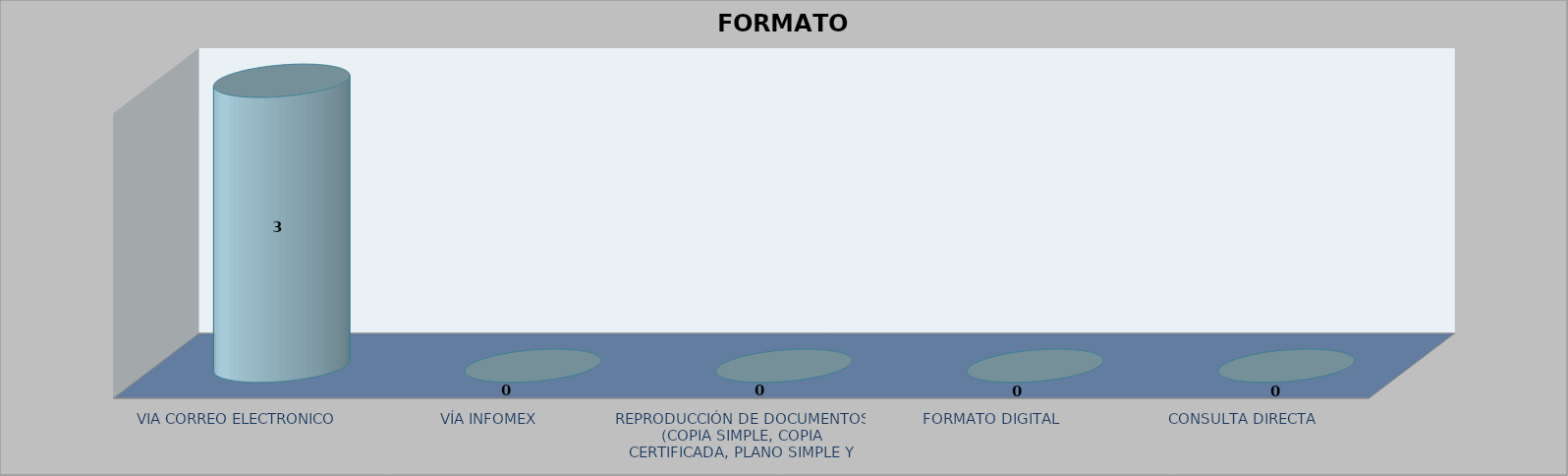
| Category |        FORMATO SOLICITADO | Series 1 | Series 2 |
|---|---|---|---|
| VIA CORREO ELECTRONICO |  |  | 3 |
| VÍA INFOMEX |  |  | 0 |
| REPRODUCCIÓN DE DOCUMENTOS (COPIA SIMPLE, COPIA CERTIFICADA, PLANO SIMPLE Y PLANO CERTIFICADO) |  |  | 0 |
| FORMATO DIGITAL |  |  | 0 |
| CONSULTA DIRECTA |  |  | 0 |